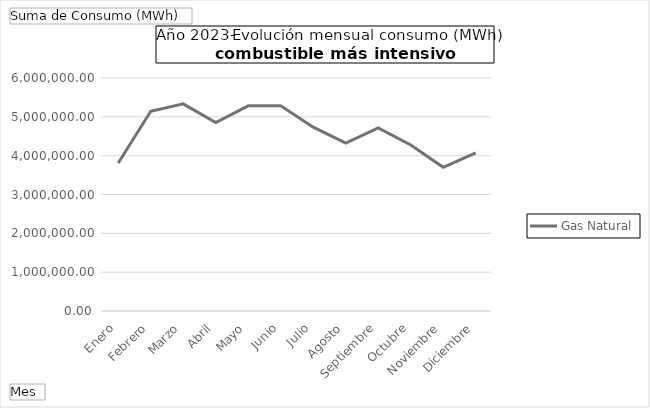
| Category | Gas Natural |
|---|---|
| Enero | 3810883.27 |
| Febrero | 5144403.72 |
| Marzo | 5332911.09 |
| Abril | 4854817.15 |
| Mayo | 5282514.46 |
| Junio | 5283997.79 |
| Julio | 4733928.567 |
| Agosto | 4323984.987 |
| Septiembre | 4712656.64 |
| Octubre | 4275461.48 |
| Noviembre | 3701373.95 |
| Diciembre | 4070083.91 |